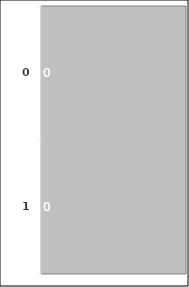
| Category | Series 0 |
|---|---|
| 0.0 | 0 |
| 1.0 | 0 |